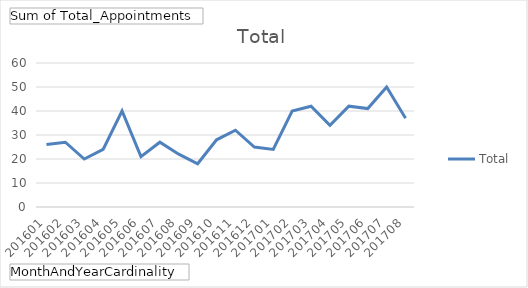
| Category | Total |
|---|---|
| 201601 | 26 |
| 201602 | 27 |
| 201603 | 20 |
| 201604 | 24 |
| 201605 | 40 |
| 201606 | 21 |
| 201607 | 27 |
| 201608 | 22 |
| 201609 | 18 |
| 201610 | 28 |
| 201611 | 32 |
| 201612 | 25 |
| 201701 | 24 |
| 201702 | 40 |
| 201703 | 42 |
| 201704 | 34 |
| 201705 | 42 |
| 201706 | 41 |
| 201707 | 50 |
| 201708 | 37 |